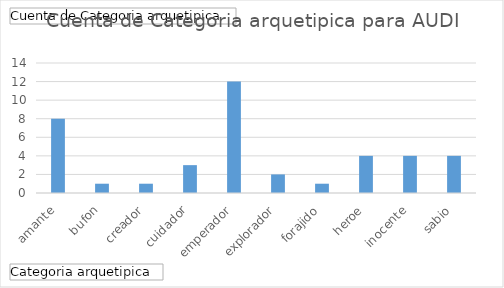
| Category | Total |
|---|---|
| amante | 8 |
| bufon | 1 |
| creador | 1 |
| cuidador | 3 |
| emperador | 12 |
| explorador | 2 |
| forajido | 1 |
| heroe | 4 |
| inocente | 4 |
| sabio | 4 |